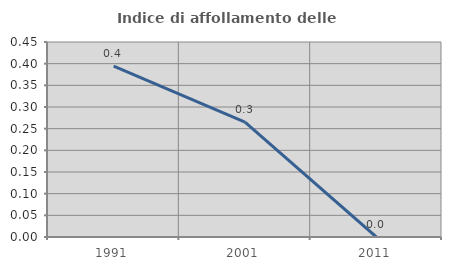
| Category | Indice di affollamento delle abitazioni  |
|---|---|
| 1991.0 | 0.394 |
| 2001.0 | 0.265 |
| 2011.0 | 0 |